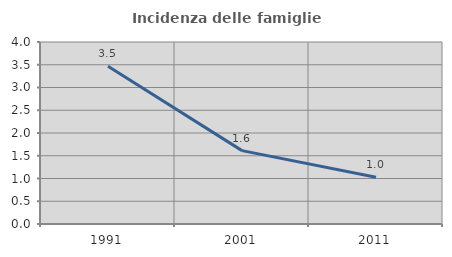
| Category | Incidenza delle famiglie numerose |
|---|---|
| 1991.0 | 3.468 |
| 2001.0 | 1.613 |
| 2011.0 | 1.026 |